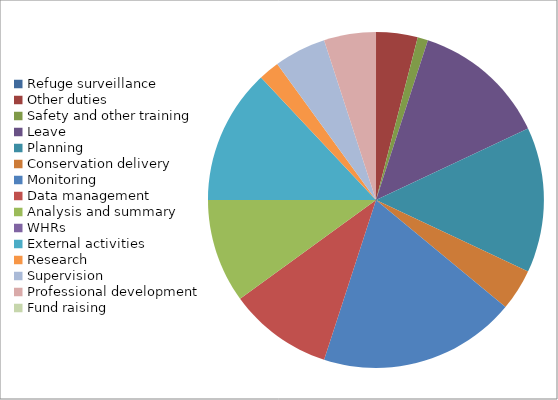
| Category | Series 0 |
|---|---|
| Refuge surveillance | 0 |
| Other duties | 4 |
| Safety and other training | 1 |
| Leave | 13 |
| Planning | 14 |
| Conservation delivery | 4 |
| Monitoring | 19 |
| Data management | 10 |
| Analysis and summary | 10 |
| WHRs | 0 |
| External activities | 13 |
| Research | 2 |
| Supervision | 5 |
| Professional development | 5 |
| Fund raising | 0 |